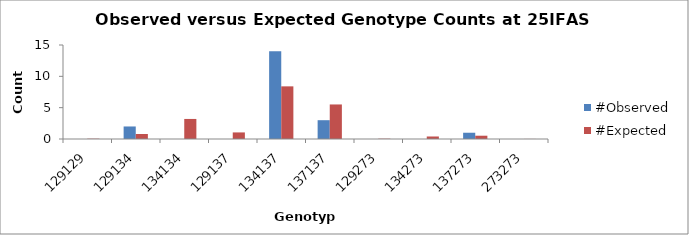
| Category | #Observed | #Expected |
|---|---|---|
| 129129.0 | 0 | 0.05 |
| 129134.0 | 2 | 0.8 |
| 134134.0 | 0 | 3.2 |
| 129137.0 | 0 | 1.05 |
| 134137.0 | 14 | 8.4 |
| 137137.0 | 3 | 5.512 |
| 129273.0 | 0 | 0.05 |
| 134273.0 | 0 | 0.4 |
| 137273.0 | 1 | 0.525 |
| 273273.0 | 0 | 0.012 |